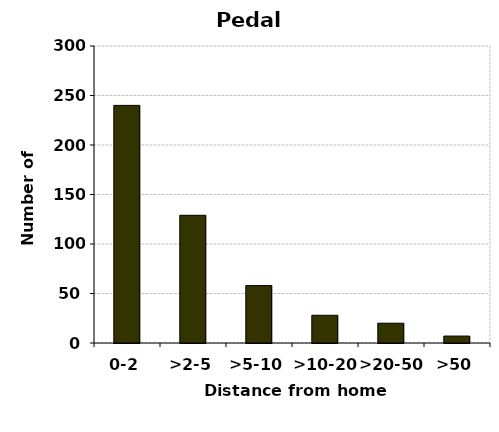
| Category | Pedal cycles |
|---|---|
| 0-2 | 240 |
| >2-5 | 129 |
| >5-10 | 58 |
| >10-20 | 28 |
| >20-50 | 20 |
| >50 | 7 |